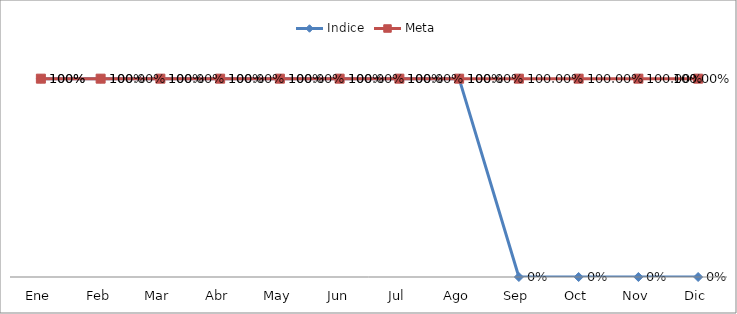
| Category | Indice | Meta |
|---|---|---|
| Ene | 1 | 1 |
| Feb | 1 | 1 |
| Mar | 1 | 1 |
| Abr | 1 | 1 |
| May | 1 | 1 |
| Jun | 1 | 1 |
| Jul | 1 | 1 |
| Ago | 1 | 1 |
| Sep | 0 | 1 |
| Oct | 0 | 1 |
| Nov | 0 | 1 |
| Dic | 0 | 1 |